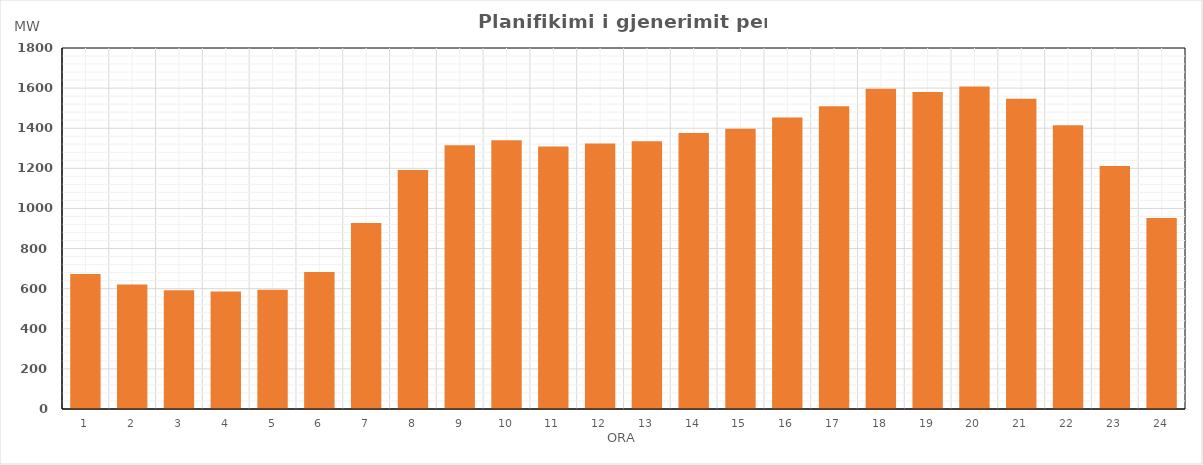
| Category | Max (MW) |
|---|---|
| 0 | 673.52 |
| 1 | 620.27 |
| 2 | 592.62 |
| 3 | 585.64 |
| 4 | 594.02 |
| 5 | 683.67 |
| 6 | 927.33 |
| 7 | 1191.41 |
| 8 | 1315.52 |
| 9 | 1340.19 |
| 10 | 1308.71 |
| 11 | 1323.46 |
| 12 | 1334.96 |
| 13 | 1376.08 |
| 14 | 1397.34 |
| 15 | 1453.85 |
| 16 | 1510.09 |
| 17 | 1596.33 |
| 18 | 1581.15 |
| 19 | 1607.78 |
| 20 | 1546.39 |
| 21 | 1414.71 |
| 22 | 1211.99 |
| 23 | 952.74 |